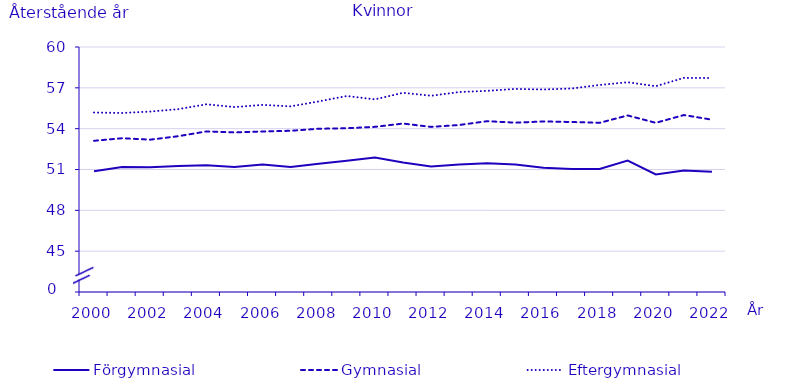
| Category | Förgymnasial | Gymnasial | Eftergymnasial |
|---|---|---|---|
| 2000.0 | 50.875 | 53.108 | 55.187 |
| 2001.0 | 51.177 | 53.296 | 55.151 |
| 2002.0 | 51.161 | 53.193 | 55.256 |
| 2003.0 | 51.259 | 53.446 | 55.434 |
| 2004.0 | 51.313 | 53.797 | 55.792 |
| 2005.0 | 51.176 | 53.728 | 55.586 |
| 2006.0 | 51.361 | 53.793 | 55.749 |
| 2007.0 | 51.188 | 53.845 | 55.637 |
| 2008.0 | 51.414 | 53.993 | 56.003 |
| 2009.0 | 51.651 | 54.031 | 56.399 |
| 2010.0 | 51.886 | 54.134 | 56.151 |
| 2011.0 | 51.511 | 54.375 | 56.635 |
| 2012.0 | 51.22 | 54.13 | 56.42 |
| 2013.0 | 51.37 | 54.27 | 56.69 |
| 2014.0 | 51.45 | 54.55 | 56.78 |
| 2015.0 | 51.36 | 54.44 | 56.92 |
| 2016.0 | 51.12 | 54.53 | 56.88 |
| 2017.0 | 51.03 | 54.49 | 56.95 |
| 2018.0 | 51.04 | 54.43 | 57.21 |
| 2019.0 | 51.66 | 54.97 | 57.41 |
| 2020.0 | 50.64 | 54.43 | 57.12 |
| 2021.0 | 50.92 | 55 | 57.73 |
| 2022.0 | 50.84 | 54.66 | 57.72 |